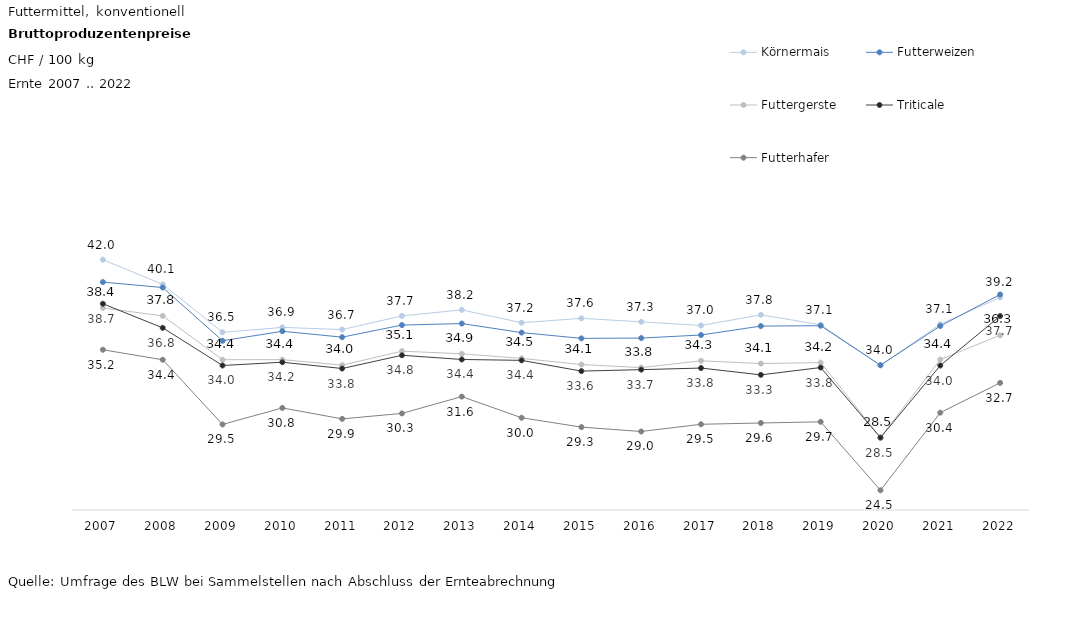
| Category | Körnermais | Futterweizen | Futtergerste | Triticale | Futterhafer |
|---|---|---|---|---|---|
| 2007.0 | 42.019 | 40.317 | 38.35 | 38.67 | 35.177 |
| 2008.0 | 40.143 | 39.905 | 37.751 | 36.842 | 34.417 |
| 2009.0 | 36.504 | 35.86 | 34.422 | 33.981 | 29.502 |
| 2010.0 | 36.875 | 36.581 | 34.427 | 34.229 | 30.756 |
| 2011.0 | 36.71 | 36.133 | 34.008 | 33.75 | 29.923 |
| 2012.0 | 37.75 | 37.053 | 35.07 | 34.757 | 30.34 |
| 2013.0 | 38.205 | 37.168 | 34.869 | 34.438 | 31.617 |
| 2014.0 | 37.23 | 36.48 | 34.52 | 34.37 | 30.01 |
| 2015.0 | 37.562 | 36.043 | 34.052 | 33.554 | 29.297 |
| 2016.0 | 37.299 | 36.065 | 33.821 | 33.665 | 28.965 |
| 2017.0 | 37.021 | 36.297 | 34.337 | 33.786 | 29.514 |
| 2018.0 | 37.829 | 36.977 | 34.126 | 33.269 | 29.611 |
| 2019.0 | 37.077 | 37.004 | 34.203 | 33.825 | 29.701 |
| 2020.0 | 34 | 34 | 28.5 | 28.5 | 24.5 |
| 2021.0 | 37.111 | 36.982 | 34.435 | 33.978 | 30.397 |
| 2022.0 | 39.154 | 39.374 | 36.276 | 37.739 | 32.659 |